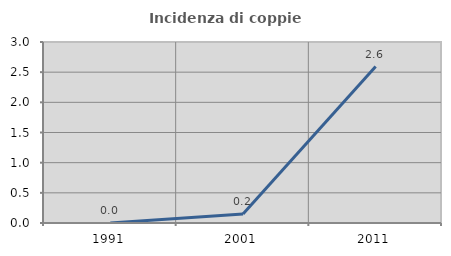
| Category | Incidenza di coppie miste |
|---|---|
| 1991.0 | 0 |
| 2001.0 | 0.15 |
| 2011.0 | 2.594 |